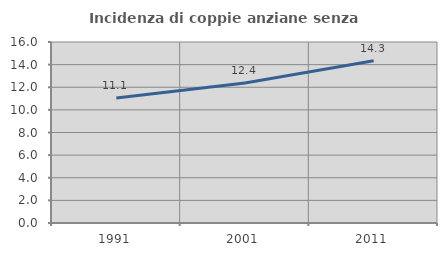
| Category | Incidenza di coppie anziane senza figli  |
|---|---|
| 1991.0 | 11.059 |
| 2001.0 | 12.367 |
| 2011.0 | 14.343 |